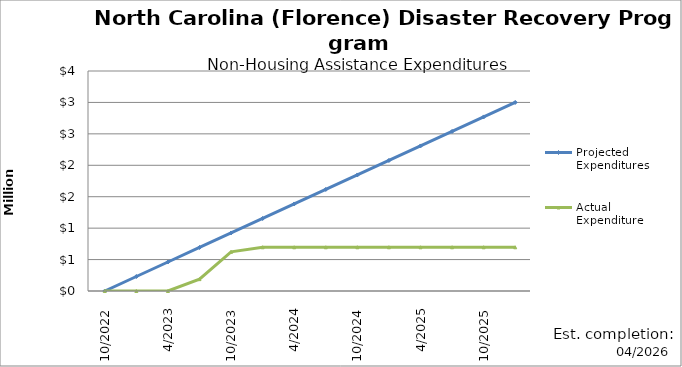
| Category | Projected Expenditures | Actual Expenditure |
|---|---|---|
| 10/2022 | 0 | 0 |
| 1/2023 | 230770 | 0 |
| 4/2023 | 461540 | 0 |
| 7/2023 | 692310 | 188876.09 |
| 10/2023 | 923080 | 622600.09 |
| 1/2024 | 1153850 | 695766.95 |
| 4/2024 | 1384620 | 695766.95 |
| 7/2024 | 1615390 | 695766.95 |
| 10/2024 | 1846160 | 695766.95 |
| 1/2025 | 2076930 | 695766.95 |
| 4/2025 | 2307700 | 695766.95 |
| 7/2025 | 2538470 | 695766.95 |
| 10/2025 | 2769230 | 695766.95 |
| 1/2026 | 3000000 | 695766.95 |